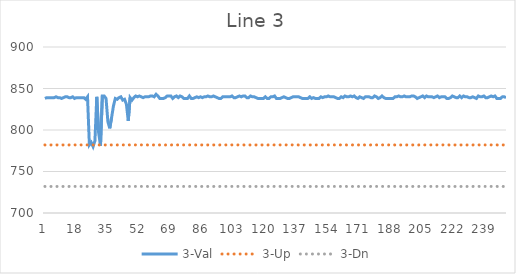
| Category | 3-Val | 3-Up | 3-Dn |
|---|---|---|---|
| 0 | 838 | 782 | 732 |
| 1 | 839 | 782 | 732 |
| 2 | 839 | 782 | 732 |
| 3 | 839 | 782 | 732 |
| 4 | 839 | 782 | 732 |
| 5 | 839 | 782 | 732 |
| 6 | 840 | 782 | 732 |
| 7 | 839 | 782 | 732 |
| 8 | 839 | 782 | 732 |
| 9 | 838 | 782 | 732 |
| 10 | 839 | 782 | 732 |
| 11 | 840 | 782 | 732 |
| 12 | 840 | 782 | 732 |
| 13 | 839 | 782 | 732 |
| 14 | 839 | 782 | 732 |
| 15 | 840 | 782 | 732 |
| 16 | 838 | 782 | 732 |
| 17 | 839 | 782 | 732 |
| 18 | 839 | 782 | 732 |
| 19 | 839 | 782 | 732 |
| 20 | 839 | 782 | 732 |
| 21 | 839 | 782 | 732 |
| 22 | 837 | 782 | 732 |
| 23 | 840 | 782 | 732 |
| 24 | 782 | 782 | 732 |
| 25 | 785 | 782 | 732 |
| 26 | 780 | 782 | 732 |
| 27 | 787 | 782 | 732 |
| 28 | 840 | 782 | 732 |
| 29 | 797 | 782 | 732 |
| 30 | 781 | 782 | 732 |
| 31 | 841 | 782 | 732 |
| 32 | 841 | 782 | 732 |
| 33 | 838 | 782 | 732 |
| 34 | 810 | 782 | 732 |
| 35 | 802 | 782 | 732 |
| 36 | 815 | 782 | 732 |
| 37 | 829 | 782 | 732 |
| 38 | 838 | 782 | 732 |
| 39 | 837 | 782 | 732 |
| 40 | 839 | 782 | 732 |
| 41 | 840 | 782 | 732 |
| 42 | 836 | 782 | 732 |
| 43 | 837 | 782 | 732 |
| 44 | 831 | 782 | 732 |
| 45 | 811 | 782 | 732 |
| 46 | 839 | 782 | 732 |
| 47 | 836 | 782 | 732 |
| 48 | 839 | 782 | 732 |
| 49 | 841 | 782 | 732 |
| 50 | 840 | 782 | 732 |
| 51 | 841 | 782 | 732 |
| 52 | 840 | 782 | 732 |
| 53 | 839 | 782 | 732 |
| 54 | 840 | 782 | 732 |
| 55 | 840 | 782 | 732 |
| 56 | 840 | 782 | 732 |
| 57 | 841 | 782 | 732 |
| 58 | 841 | 782 | 732 |
| 59 | 840 | 782 | 732 |
| 60 | 843 | 782 | 732 |
| 61 | 841 | 782 | 732 |
| 62 | 838 | 782 | 732 |
| 63 | 838 | 782 | 732 |
| 64 | 838 | 782 | 732 |
| 65 | 839 | 782 | 732 |
| 66 | 841 | 782 | 732 |
| 67 | 841 | 782 | 732 |
| 68 | 841 | 782 | 732 |
| 69 | 838 | 782 | 732 |
| 70 | 840 | 782 | 732 |
| 71 | 841 | 782 | 732 |
| 72 | 839 | 782 | 732 |
| 73 | 841 | 782 | 732 |
| 74 | 840 | 782 | 732 |
| 75 | 838 | 782 | 732 |
| 76 | 838 | 782 | 732 |
| 77 | 838 | 782 | 732 |
| 78 | 841 | 782 | 732 |
| 79 | 838 | 782 | 732 |
| 80 | 838 | 782 | 732 |
| 81 | 839 | 782 | 732 |
| 82 | 840 | 782 | 732 |
| 83 | 839 | 782 | 732 |
| 84 | 840 | 782 | 732 |
| 85 | 839 | 782 | 732 |
| 86 | 840 | 782 | 732 |
| 87 | 840 | 782 | 732 |
| 88 | 841 | 782 | 732 |
| 89 | 840 | 782 | 732 |
| 90 | 840 | 782 | 732 |
| 91 | 841 | 782 | 732 |
| 92 | 840 | 782 | 732 |
| 93 | 839 | 782 | 732 |
| 94 | 838 | 782 | 732 |
| 95 | 838 | 782 | 732 |
| 96 | 840 | 782 | 732 |
| 97 | 840 | 782 | 732 |
| 98 | 840 | 782 | 732 |
| 99 | 840 | 782 | 732 |
| 100 | 840 | 782 | 732 |
| 101 | 841 | 782 | 732 |
| 102 | 839 | 782 | 732 |
| 103 | 839 | 782 | 732 |
| 104 | 840 | 782 | 732 |
| 105 | 841 | 782 | 732 |
| 106 | 840 | 782 | 732 |
| 107 | 841 | 782 | 732 |
| 108 | 841 | 782 | 732 |
| 109 | 839 | 782 | 732 |
| 110 | 839 | 782 | 732 |
| 111 | 841 | 782 | 732 |
| 112 | 840 | 782 | 732 |
| 113 | 840 | 782 | 732 |
| 114 | 839 | 782 | 732 |
| 115 | 838 | 782 | 732 |
| 116 | 838 | 782 | 732 |
| 117 | 838 | 782 | 732 |
| 118 | 838 | 782 | 732 |
| 119 | 840 | 782 | 732 |
| 120 | 838 | 782 | 732 |
| 121 | 838 | 782 | 732 |
| 122 | 840 | 782 | 732 |
| 123 | 840 | 782 | 732 |
| 124 | 841 | 782 | 732 |
| 125 | 838 | 782 | 732 |
| 126 | 838 | 782 | 732 |
| 127 | 838 | 782 | 732 |
| 128 | 839 | 782 | 732 |
| 129 | 840 | 782 | 732 |
| 130 | 839 | 782 | 732 |
| 131 | 838 | 782 | 732 |
| 132 | 838 | 782 | 732 |
| 133 | 839 | 782 | 732 |
| 134 | 840 | 782 | 732 |
| 135 | 840 | 782 | 732 |
| 136 | 840 | 782 | 732 |
| 137 | 840 | 782 | 732 |
| 138 | 839 | 782 | 732 |
| 139 | 838 | 782 | 732 |
| 140 | 838 | 782 | 732 |
| 141 | 838 | 782 | 732 |
| 142 | 838 | 782 | 732 |
| 143 | 840 | 782 | 732 |
| 144 | 838 | 782 | 732 |
| 145 | 839 | 782 | 732 |
| 146 | 838 | 782 | 732 |
| 147 | 838 | 782 | 732 |
| 148 | 838 | 782 | 732 |
| 149 | 840 | 782 | 732 |
| 150 | 839 | 782 | 732 |
| 151 | 840 | 782 | 732 |
| 152 | 840 | 782 | 732 |
| 153 | 841 | 782 | 732 |
| 154 | 840 | 782 | 732 |
| 155 | 840 | 782 | 732 |
| 156 | 840 | 782 | 732 |
| 157 | 839 | 782 | 732 |
| 158 | 838 | 782 | 732 |
| 159 | 838 | 782 | 732 |
| 160 | 840 | 782 | 732 |
| 161 | 839 | 782 | 732 |
| 162 | 841 | 782 | 732 |
| 163 | 840 | 782 | 732 |
| 164 | 840 | 782 | 732 |
| 165 | 841 | 782 | 732 |
| 166 | 840 | 782 | 732 |
| 167 | 841 | 782 | 732 |
| 168 | 839 | 782 | 732 |
| 169 | 838 | 782 | 732 |
| 170 | 840 | 782 | 732 |
| 171 | 839 | 782 | 732 |
| 172 | 838 | 782 | 732 |
| 173 | 840 | 782 | 732 |
| 174 | 840 | 782 | 732 |
| 175 | 840 | 782 | 732 |
| 176 | 839 | 782 | 732 |
| 177 | 839 | 782 | 732 |
| 178 | 841 | 782 | 732 |
| 179 | 840 | 782 | 732 |
| 180 | 838 | 782 | 732 |
| 181 | 839 | 782 | 732 |
| 182 | 841 | 782 | 732 |
| 183 | 839 | 782 | 732 |
| 184 | 838 | 782 | 732 |
| 185 | 838 | 782 | 732 |
| 186 | 838 | 782 | 732 |
| 187 | 838 | 782 | 732 |
| 188 | 838 | 782 | 732 |
| 189 | 840 | 782 | 732 |
| 190 | 840 | 782 | 732 |
| 191 | 841 | 782 | 732 |
| 192 | 840 | 782 | 732 |
| 193 | 840 | 782 | 732 |
| 194 | 841 | 782 | 732 |
| 195 | 840 | 782 | 732 |
| 196 | 840 | 782 | 732 |
| 197 | 840 | 782 | 732 |
| 198 | 841 | 782 | 732 |
| 199 | 841 | 782 | 732 |
| 200 | 840 | 782 | 732 |
| 201 | 838 | 782 | 732 |
| 202 | 839 | 782 | 732 |
| 203 | 840 | 782 | 732 |
| 204 | 841 | 782 | 732 |
| 205 | 839 | 782 | 732 |
| 206 | 841 | 782 | 732 |
| 207 | 840 | 782 | 732 |
| 208 | 840 | 782 | 732 |
| 209 | 840 | 782 | 732 |
| 210 | 839 | 782 | 732 |
| 211 | 840 | 782 | 732 |
| 212 | 841 | 782 | 732 |
| 213 | 839 | 782 | 732 |
| 214 | 840 | 782 | 732 |
| 215 | 840 | 782 | 732 |
| 216 | 840 | 782 | 732 |
| 217 | 838 | 782 | 732 |
| 218 | 838 | 782 | 732 |
| 219 | 839 | 782 | 732 |
| 220 | 841 | 782 | 732 |
| 221 | 840 | 782 | 732 |
| 222 | 839 | 782 | 732 |
| 223 | 839 | 782 | 732 |
| 224 | 841 | 782 | 732 |
| 225 | 839 | 782 | 732 |
| 226 | 841 | 782 | 732 |
| 227 | 840 | 782 | 732 |
| 228 | 840 | 782 | 732 |
| 229 | 839 | 782 | 732 |
| 230 | 839 | 782 | 732 |
| 231 | 840 | 782 | 732 |
| 232 | 839 | 782 | 732 |
| 233 | 838 | 782 | 732 |
| 234 | 841 | 782 | 732 |
| 235 | 840 | 782 | 732 |
| 236 | 840 | 782 | 732 |
| 237 | 841 | 782 | 732 |
| 238 | 839 | 782 | 732 |
| 239 | 839 | 782 | 732 |
| 240 | 840 | 782 | 732 |
| 241 | 841 | 782 | 732 |
| 242 | 840 | 782 | 732 |
| 243 | 841 | 782 | 732 |
| 244 | 838 | 782 | 732 |
| 245 | 838 | 782 | 732 |
| 246 | 838 | 782 | 732 |
| 247 | 840 | 782 | 732 |
| 248 | 840 | 782 | 732 |
| 249 | 839 | 782 | 732 |